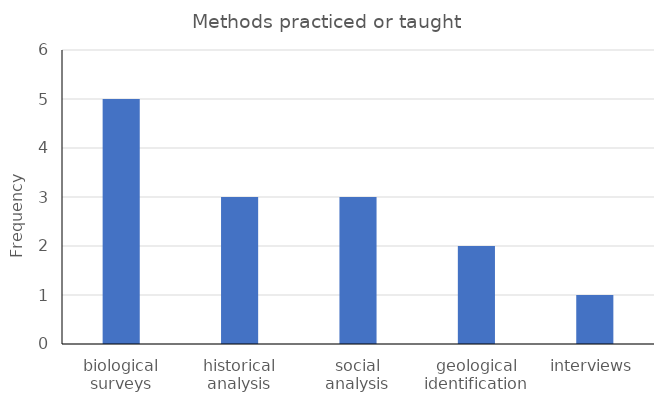
| Category | Frequency |
|---|---|
| biological surveys | 5 |
| historical analysis | 3 |
| social analysis | 3 |
| geological identification | 2 |
| interviews | 1 |